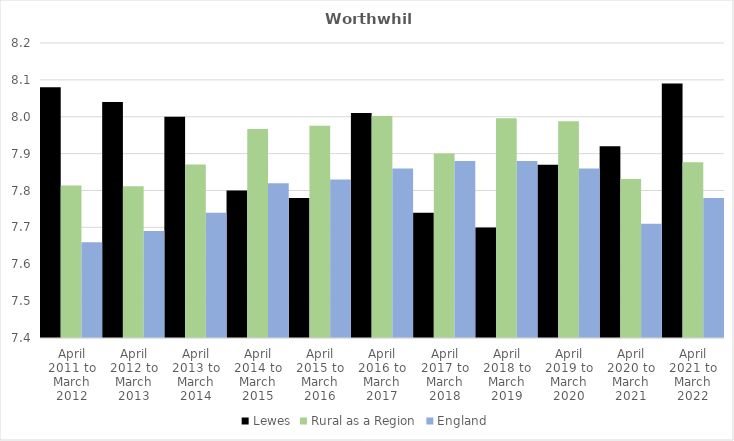
| Category | Lewes | Rural as a Region | England |
|---|---|---|---|
| April 2011 to March 2012 | 8.08 | 7.813 | 7.66 |
| April 2012 to March 2013 | 8.04 | 7.811 | 7.69 |
| April 2013 to March 2014 | 8 | 7.871 | 7.74 |
| April 2014 to March 2015 | 7.8 | 7.967 | 7.82 |
| April 2015 to March 2016 | 7.78 | 7.975 | 7.83 |
| April 2016 to March 2017 | 8.01 | 8.002 | 7.86 |
| April 2017 to March 2018 | 7.74 | 7.9 | 7.88 |
| April 2018 to March 2019 | 7.7 | 7.996 | 7.88 |
| April 2019 to March 2020 | 7.87 | 7.988 | 7.86 |
| April 2020 to March 2021 | 7.92 | 7.831 | 7.71 |
| April 2021 to March 2022 | 8.09 | 7.877 | 7.78 |